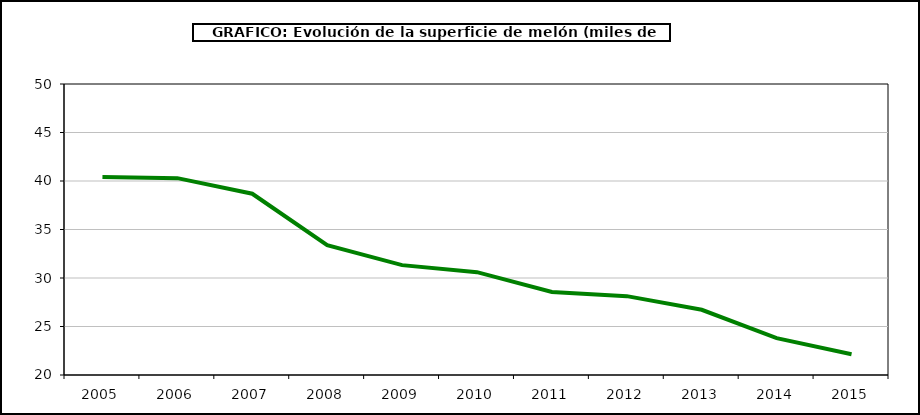
| Category | superficie |
|---|---|
| 2005.0 | 40.423 |
| 2006.0 | 40.294 |
| 2007.0 | 38.688 |
| 2008.0 | 33.388 |
| 2009.0 | 31.327 |
| 2010.0 | 30.601 |
| 2011.0 | 28.561 |
| 2012.0 | 28.13 |
| 2013.0 | 26.723 |
| 2014.0 | 23.8 |
| 2015.0 | 22.144 |